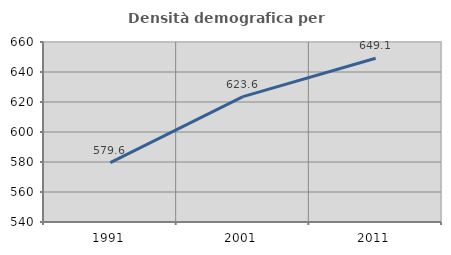
| Category | Densità demografica |
|---|---|
| 1991.0 | 579.594 |
| 2001.0 | 623.572 |
| 2011.0 | 649.15 |